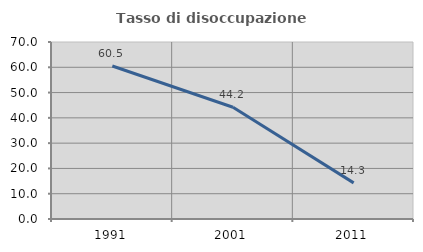
| Category | Tasso di disoccupazione giovanile  |
|---|---|
| 1991.0 | 60.494 |
| 2001.0 | 44.186 |
| 2011.0 | 14.286 |